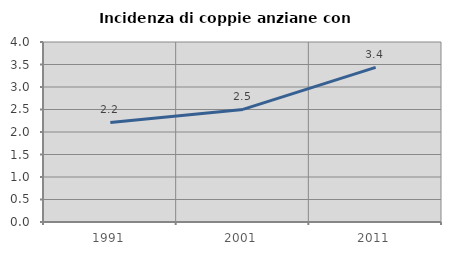
| Category | Incidenza di coppie anziane con figli |
|---|---|
| 1991.0 | 2.213 |
| 2001.0 | 2.502 |
| 2011.0 | 3.436 |